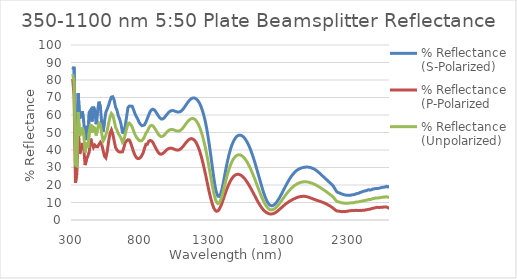
| Category | % Reflectance (S-Polarized) | % Reflectance (P-Polarized | % Reflectance (Unpolarized) |
|---|---|---|---|
| 300.0 | 85.959 | 80.703 | 83.331 |
| 310.0 | 87.526 | 70.761 | 79.143 |
| 320.0 | 41.319 | 21.313 | 31.316 |
| 330.0 | 35.099 | 26.601 | 30.85 |
| 340.0 | 72.365 | 50.79 | 61.577 |
| 350.0 | 58.166 | 37.775 | 47.971 |
| 360.0 | 59.752 | 40.126 | 49.939 |
| 370.0 | 62.092 | 44.002 | 53.047 |
| 380.0 | 56.085 | 40.861 | 48.473 |
| 390.0 | 45.683 | 31.385 | 38.534 |
| 400.0 | 53.793 | 34.736 | 44.264 |
| 410.0 | 46.06 | 36.631 | 41.346 |
| 420.0 | 61.565 | 38.936 | 50.251 |
| 430.0 | 62.82 | 46.487 | 54.654 |
| 440.0 | 56.285 | 43.593 | 49.939 |
| 450.0 | 64.747 | 41.416 | 53.081 |
| 460.0 | 62.368 | 42.764 | 52.566 |
| 470.0 | 54.723 | 41.843 | 48.283 |
| 480.0 | 62.334 | 41.792 | 52.063 |
| 490.0 | 67.605 | 43.187 | 55.396 |
| 500.0 | 64.729 | 44.413 | 54.571 |
| 510.0 | 55.379 | 43.151 | 49.265 |
| 520.0 | 50.473 | 39.809 | 45.141 |
| 530.0 | 56.471 | 36.472 | 46.472 |
| 540.0 | 61.596 | 35.511 | 48.554 |
| 550.0 | 63.463 | 39.204 | 51.334 |
| 560.0 | 65.629 | 44.992 | 55.31 |
| 570.0 | 68.224 | 49.563 | 58.893 |
| 580.0 | 70.252 | 51.493 | 60.872 |
| 590.0 | 70.455 | 49.199 | 59.827 |
| 600.0 | 68.504 | 45.18 | 56.842 |
| 610.0 | 64.553 | 41.456 | 53.004 |
| 620.0 | 62.825 | 40.028 | 51.426 |
| 630.0 | 59.489 | 39.197 | 49.343 |
| 640.0 | 57.592 | 38.793 | 48.192 |
| 650.0 | 54.682 | 38.787 | 46.734 |
| 660.0 | 50.077 | 38.959 | 44.518 |
| 670.0 | 49.949 | 41.249 | 45.599 |
| 680.0 | 53.659 | 44.396 | 49.027 |
| 690.0 | 59.051 | 45.222 | 52.136 |
| 700.0 | 64.33 | 45.855 | 55.093 |
| 710.0 | 65.128 | 45.656 | 55.392 |
| 720.0 | 65.056 | 43.935 | 54.495 |
| 730.0 | 65.03 | 41.507 | 53.268 |
| 740.0 | 63.087 | 39.07 | 51.079 |
| 750.0 | 60.852 | 37.06 | 48.956 |
| 760.0 | 59.1 | 35.747 | 47.423 |
| 770.0 | 57.794 | 35.114 | 46.454 |
| 780.0 | 55.847 | 35.115 | 45.481 |
| 790.0 | 54.679 | 35.704 | 45.191 |
| 800.0 | 53.89 | 36.812 | 45.351 |
| 810.0 | 54.071 | 38.459 | 46.265 |
| 820.0 | 54.375 | 41.072 | 47.723 |
| 830.0 | 56.041 | 43.279 | 49.66 |
| 840.0 | 57.994 | 43.266 | 50.63 |
| 850.0 | 60.042 | 44.993 | 52.517 |
| 860.0 | 61.897 | 45.445 | 53.671 |
| 870.0 | 62.948 | 45.216 | 54.082 |
| 880.0 | 63.288 | 44.344 | 53.816 |
| 890.0 | 62.957 | 42.698 | 52.828 |
| 900.0 | 61.986 | 41.223 | 51.605 |
| 910.0 | 60.697 | 39.745 | 50.221 |
| 920.0 | 59.447 | 38.497 | 48.972 |
| 930.0 | 58.407 | 37.759 | 48.083 |
| 940.0 | 57.769 | 37.593 | 47.681 |
| 950.0 | 57.731 | 37.915 | 47.823 |
| 960.0 | 58.247 | 38.561 | 48.404 |
| 970.0 | 59.142 | 39.351 | 49.246 |
| 980.0 | 60.163 | 40.106 | 50.135 |
| 990.0 | 61.128 | 40.679 | 50.904 |
| 1000.0 | 61.907 | 41.004 | 51.456 |
| 1010.0 | 62.387 | 41.083 | 51.735 |
| 1020.0 | 62.562 | 40.93 | 51.746 |
| 1030.0 | 62.455 | 40.621 | 51.538 |
| 1040.0 | 62.175 | 40.282 | 51.229 |
| 1050.0 | 61.885 | 40.007 | 50.946 |
| 1060.0 | 61.691 | 39.913 | 50.802 |
| 1070.0 | 61.705 | 40.09 | 50.898 |
| 1080.0 | 61.991 | 40.566 | 51.278 |
| 1090.0 | 62.613 | 41.294 | 51.954 |
| 1100.0 | 63.521 | 42.211 | 52.866 |
| 1110.0 | 64.621 | 43.249 | 53.935 |
| 1120.0 | 65.814 | 44.283 | 55.049 |
| 1130.0 | 66.963 | 45.188 | 56.076 |
| 1140.0 | 67.965 | 45.896 | 56.931 |
| 1150.0 | 68.805 | 46.359 | 57.582 |
| 1160.0 | 69.438 | 46.485 | 57.962 |
| 1170.0 | 69.757 | 46.232 | 57.994 |
| 1180.0 | 69.75 | 45.631 | 57.691 |
| 1190.0 | 69.42 | 44.608 | 57.014 |
| 1200.0 | 68.725 | 43.113 | 55.919 |
| 1210.0 | 67.713 | 41.252 | 54.482 |
| 1220.0 | 66.345 | 39.02 | 52.682 |
| 1230.0 | 64.505 | 36.344 | 50.424 |
| 1240.0 | 62.132 | 33.238 | 47.685 |
| 1250.0 | 59.338 | 29.867 | 44.603 |
| 1260.0 | 56.017 | 26.318 | 41.168 |
| 1270.0 | 51.928 | 22.538 | 37.233 |
| 1280.0 | 47.125 | 18.717 | 32.921 |
| 1290.0 | 41.868 | 15.16 | 28.514 |
| 1300.0 | 36.201 | 11.958 | 24.079 |
| 1310.0 | 30.206 | 9.156 | 19.681 |
| 1320.0 | 24.309 | 6.964 | 15.636 |
| 1330.0 | 19.266 | 5.562 | 12.414 |
| 1340.0 | 15.599 | 4.972 | 10.286 |
| 1350.0 | 13.598 | 5.177 | 9.388 |
| 1360.0 | 13.478 | 6.171 | 9.825 |
| 1370.0 | 15.004 | 7.74 | 11.372 |
| 1380.0 | 17.737 | 9.677 | 13.707 |
| 1390.0 | 21.518 | 11.951 | 16.734 |
| 1400.0 | 25.791 | 14.343 | 20.067 |
| 1410.0 | 29.941 | 16.627 | 23.284 |
| 1420.0 | 33.735 | 18.697 | 26.216 |
| 1430.0 | 37.152 | 20.577 | 28.865 |
| 1440.0 | 40.086 | 22.205 | 31.146 |
| 1450.0 | 42.497 | 23.525 | 33.011 |
| 1460.0 | 44.444 | 24.568 | 34.506 |
| 1470.0 | 46.006 | 25.355 | 35.681 |
| 1480.0 | 47.17 | 25.852 | 36.511 |
| 1490.0 | 47.959 | 26.083 | 37.021 |
| 1500.0 | 48.406 | 26.089 | 37.248 |
| 1510.0 | 48.489 | 25.854 | 37.172 |
| 1520.0 | 48.284 | 25.401 | 36.842 |
| 1530.0 | 47.796 | 24.778 | 36.287 |
| 1540.0 | 47.06 | 23.955 | 35.508 |
| 1550.0 | 46.045 | 22.939 | 34.492 |
| 1560.0 | 44.759 | 21.813 | 33.286 |
| 1570.0 | 43.239 | 20.596 | 31.917 |
| 1580.0 | 41.472 | 19.267 | 30.37 |
| 1590.0 | 39.45 | 17.856 | 28.653 |
| 1600.0 | 37.18 | 16.357 | 26.768 |
| 1610.0 | 34.785 | 14.886 | 24.835 |
| 1620.0 | 32.213 | 13.399 | 22.806 |
| 1630.0 | 29.506 | 11.872 | 20.689 |
| 1640.0 | 26.728 | 10.39 | 18.559 |
| 1650.0 | 23.967 | 9.069 | 16.518 |
| 1660.0 | 21.181 | 7.81 | 14.495 |
| 1670.0 | 18.455 | 6.695 | 12.575 |
| 1680.0 | 15.844 | 5.753 | 10.798 |
| 1690.0 | 13.594 | 4.976 | 9.285 |
| 1700.0 | 11.638 | 4.337 | 7.987 |
| 1710.0 | 10.058 | 3.883 | 6.971 |
| 1720.0 | 8.958 | 3.54 | 6.249 |
| 1730.0 | 8.317 | 3.431 | 5.874 |
| 1740.0 | 8.109 | 3.451 | 5.78 |
| 1750.0 | 8.328 | 3.624 | 5.976 |
| 1760.0 | 8.886 | 3.94 | 6.413 |
| 1770.0 | 9.684 | 4.401 | 7.043 |
| 1780.0 | 10.742 | 4.983 | 7.862 |
| 1790.0 | 11.988 | 5.664 | 8.826 |
| 1800.0 | 13.362 | 6.366 | 9.864 |
| 1810.0 | 14.807 | 7.051 | 10.929 |
| 1820.0 | 16.303 | 7.789 | 12.046 |
| 1830.0 | 17.845 | 8.463 | 13.154 |
| 1840.0 | 19.41 | 9.133 | 14.272 |
| 1850.0 | 20.868 | 9.724 | 15.296 |
| 1860.0 | 22.253 | 10.235 | 16.244 |
| 1870.0 | 23.6 | 10.761 | 17.181 |
| 1880.0 | 24.833 | 11.216 | 18.024 |
| 1890.0 | 25.843 | 11.657 | 18.75 |
| 1900.0 | 26.765 | 12.065 | 19.415 |
| 1910.0 | 27.598 | 12.397 | 19.997 |
| 1920.0 | 28.287 | 12.762 | 20.525 |
| 1930.0 | 28.843 | 13.026 | 20.935 |
| 1940.0 | 29.23 | 13.276 | 21.253 |
| 1950.0 | 29.591 | 13.417 | 21.504 |
| 1960.0 | 29.862 | 13.499 | 21.681 |
| 1970.0 | 30.066 | 13.554 | 21.81 |
| 1980.0 | 30.182 | 13.496 | 21.839 |
| 1990.0 | 30.232 | 13.373 | 21.803 |
| 2000.0 | 30.232 | 13.151 | 21.692 |
| 2010.0 | 30.142 | 12.894 | 21.518 |
| 2020.0 | 29.974 | 12.6 | 21.287 |
| 2030.0 | 29.677 | 12.319 | 20.998 |
| 2040.0 | 29.358 | 12.022 | 20.69 |
| 2050.0 | 28.969 | 11.698 | 20.333 |
| 2060.0 | 28.44 | 11.437 | 19.939 |
| 2070.0 | 27.837 | 11.133 | 19.485 |
| 2080.0 | 27.149 | 10.88 | 19.015 |
| 2090.0 | 26.472 | 10.607 | 18.539 |
| 2100.0 | 25.691 | 10.319 | 18.005 |
| 2110.0 | 24.963 | 10.028 | 17.495 |
| 2120.0 | 24.239 | 9.724 | 16.982 |
| 2130.0 | 23.506 | 9.352 | 16.429 |
| 2140.0 | 22.774 | 8.963 | 15.868 |
| 2150.0 | 22.031 | 8.451 | 15.241 |
| 2160.0 | 21.308 | 8.059 | 14.683 |
| 2170.0 | 20.617 | 7.568 | 14.092 |
| 2180.0 | 19.872 | 6.991 | 13.432 |
| 2190.0 | 18.74 | 6.328 | 12.534 |
| 2200.0 | 17.357 | 5.681 | 11.519 |
| 2210.0 | 16.175 | 5.195 | 10.685 |
| 2220.0 | 15.645 | 5.09 | 10.367 |
| 2230.0 | 15.466 | 4.954 | 10.21 |
| 2240.0 | 15.072 | 4.838 | 9.955 |
| 2250.0 | 14.79 | 4.762 | 9.776 |
| 2260.0 | 14.497 | 4.856 | 9.676 |
| 2270.0 | 14.265 | 4.78 | 9.523 |
| 2280.0 | 14.206 | 4.965 | 9.585 |
| 2290.0 | 14.084 | 5.031 | 9.558 |
| 2300.0 | 14.073 | 5.284 | 9.678 |
| 2310.0 | 14.168 | 5.271 | 9.719 |
| 2320.0 | 14.38 | 5.445 | 9.912 |
| 2330.0 | 14.375 | 5.339 | 9.857 |
| 2340.0 | 14.62 | 5.42 | 10.02 |
| 2350.0 | 14.998 | 5.543 | 10.27 |
| 2360.0 | 15.141 | 5.373 | 10.257 |
| 2370.0 | 15.35 | 5.458 | 10.404 |
| 2380.0 | 15.768 | 5.507 | 10.637 |
| 2390.0 | 16.015 | 5.433 | 10.724 |
| 2400.0 | 16.318 | 5.606 | 10.962 |
| 2410.0 | 16.542 | 5.602 | 11.072 |
| 2420.0 | 16.717 | 5.794 | 11.255 |
| 2430.0 | 16.944 | 5.909 | 11.427 |
| 2440.0 | 17.31 | 6.101 | 11.705 |
| 2450.0 | 17.108 | 6.153 | 11.63 |
| 2460.0 | 17.255 | 6.456 | 11.856 |
| 2470.0 | 17.708 | 6.703 | 12.206 |
| 2480.0 | 17.762 | 6.821 | 12.291 |
| 2490.0 | 17.992 | 7.06 | 12.526 |
| 2500.0 | 17.941 | 7.233 | 12.587 |
| 2510.0 | 18.048 | 7.204 | 12.626 |
| 2520.0 | 18.256 | 7.168 | 12.712 |
| 2530.0 | 18.429 | 7.335 | 12.882 |
| 2540.0 | 18.721 | 7.206 | 12.964 |
| 2550.0 | 18.768 | 7.439 | 13.103 |
| 2560.0 | 18.833 | 7.411 | 13.122 |
| 2570.0 | 19.246 | 7.413 | 13.33 |
| 2580.0 | 18.854 | 7.065 | 12.96 |
| 2590.0 | 19.314 | 6.678 | 12.996 |